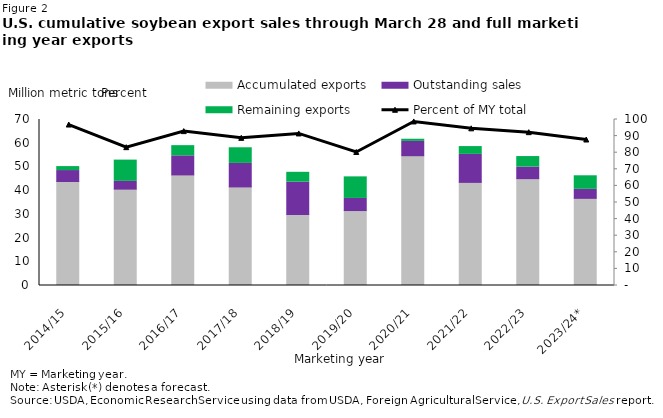
| Category | Accumulated exports | Outstanding sales | Remaining exports |
|---|---|---|---|
| 2014/15 | 43866365 | 4604448 | 1673195.944 |
| 2015/16 | 40644027 | 3264191 | 8969528.208 |
| 2016/17 | 46643590 | 8026298 | 4303632.942 |
| 2017/18 | 41578481 | 9905695 | 6595979.098 |
| 2018/19 | 29940623 | 13635886 | 4151855.6 |
| 2019/20 | 31607150 | 5101956 | 9098751.5 |
| 2020/21 | 54739717 | 6024919 | 909397.474 |
| 2021/22 | 43488883 | 11797083 | 3294577.08 |
| 2022/23 | 45066302 | 4849932 | 4456292.242 |
| 2023/24* | 36760875 | 3788247 | 5717299.779 |